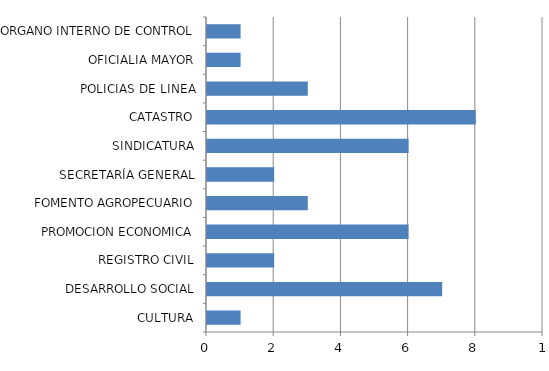
| Category | Series 0 |
|---|---|
| CULTURA | 1 |
| DESARROLLO SOCIAL | 7 |
| REGISTRO CIVIL | 2 |
| PROMOCION ECONOMICA | 6 |
| FOMENTO AGROPECUARIO | 3 |
| SECRETARÍA GENERAL | 2 |
| SINDICATURA | 6 |
| CATASTRO | 8 |
| POLICIAS DE LINEA | 3 |
| OFICIALIA MAYOR | 1 |
| ORGANO INTERNO DE CONTROL | 1 |